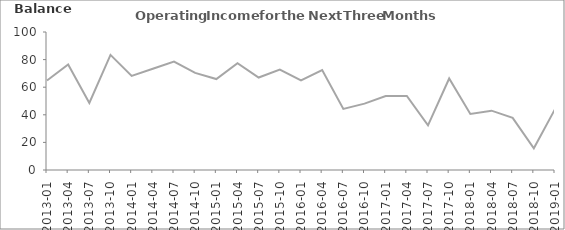
| Category | Balance |
|---|---|
| 2013-01 | 64.9 |
| 2013-04 | 76.4 |
| 2013-07 | 48.6 |
| 2013-10 | 83.4 |
| 2014-01 | 68.2 |
| 2014-04 | 73.4 |
| 2014-07 | 78.6 |
| 2014-10 | 70.4 |
| 2015-01 | 65.9 |
| 2015-04 | 77.4 |
| 2015-07 | 67 |
| 2015-10 | 72.7 |
| 2016-01 | 65 |
| 2016-04 | 72.4 |
| 2016-07 | 44.3 |
| 2016-10 | 48.1 |
| 2017-01 | 53.6 |
| 2017-04 | 53.6 |
| 2017-07 | 32.4 |
| 2017-10 | 66.3 |
| 2018-01 | 40.6 |
| 2018-04 | 43 |
| 2018-07 | 37.8 |
| 2018-10 | 15.7 |
| 2019-01 | 44.1 |